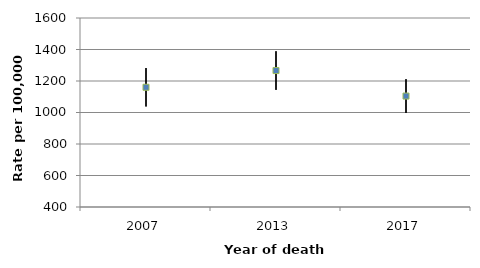
| Category | Upper | Lower | Rate |
|---|---|---|---|
| 2007.0 | 1282.1 | 1038.3 | 1160.2 |
| 2013.0 | 1388.7 | 1143.9 | 1266.3 |
| 2017.0 | 1211.5 | 997.4 | 1104.4 |